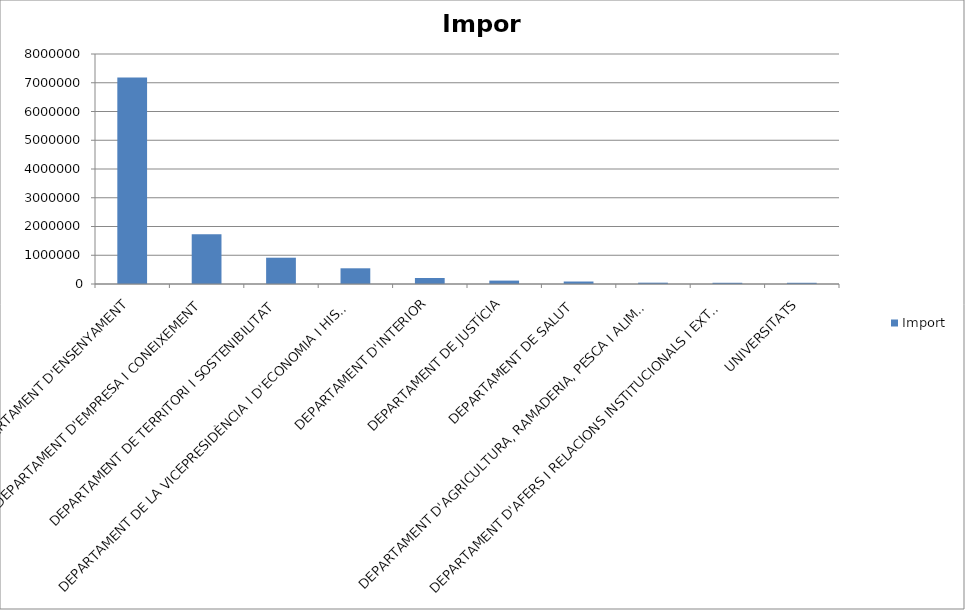
| Category | Import |
|---|---|
| DEPARTAMENT D'ENSENYAMENT | 7185861.865 |
| DEPARTAMENT D'EMPRESA I CONEIXEMENT | 1727498.164 |
| DEPARTAMENT DE TERRITORI I SOSTENIBILITAT | 914856.781 |
| DEPARTAMENT DE LA VICEPRESIDÈNCIA I D'ECONOMIA I HISENDA | 546289.07 |
| DEPARTAMENT D'INTERIOR | 209632.5 |
| DEPARTAMENT DE JUSTÍCIA | 118662.96 |
| DEPARTAMENT DE SALUT | 86308.765 |
| DEPARTAMENT D'AGRICULTURA, RAMADERIA, PESCA I ALIMENTACIÓ | 46041.712 |
| DEPARTAMENT D'AFERS I RELACIONS INSTITUCIONALS I EXTERIORS I TRANSPARÈNCIA | 42289.05 |
| UNIVERSITATS | 42163.054 |